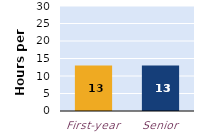
| Category | hours per week |
|---|---|
| First-year | 13 |
| Senior | 13 |